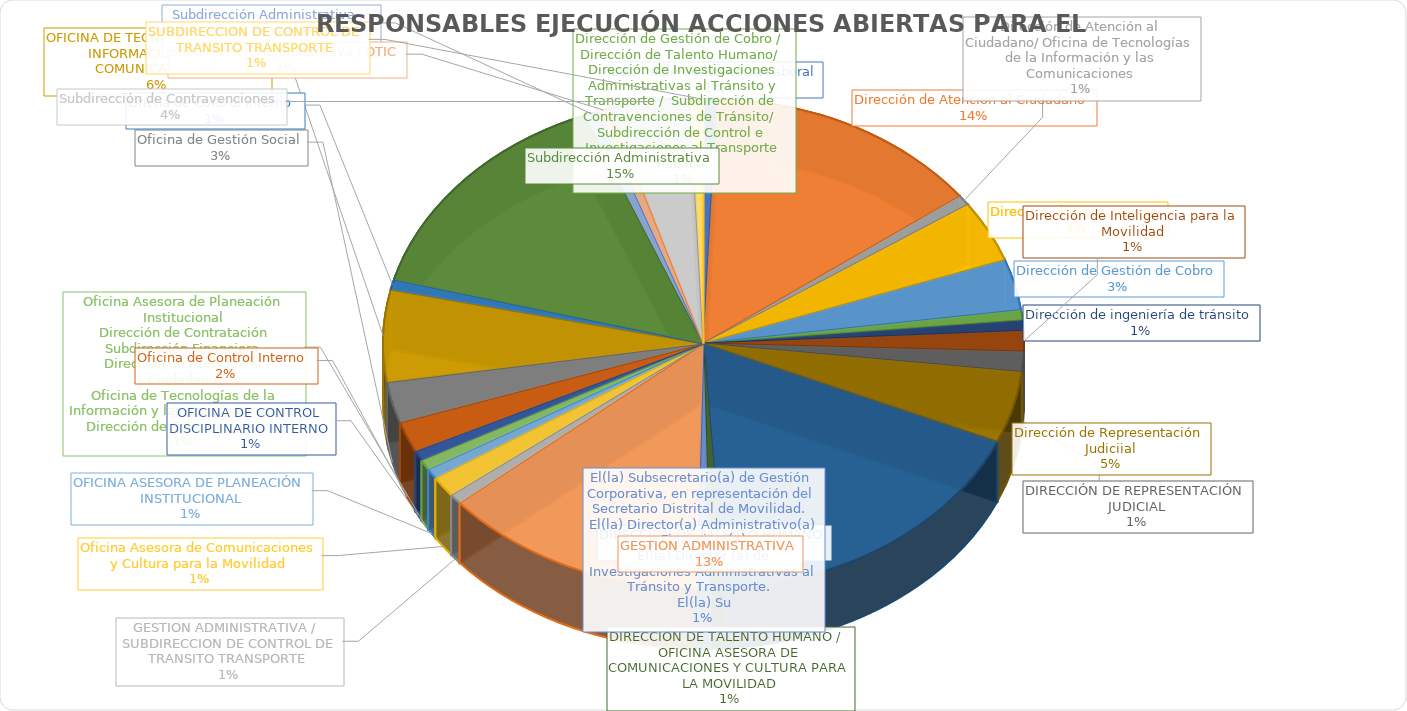
| Category | Cuenta de ESTADO DE LA ACCION |
|---|---|
| Comité de Convivencia Laboral | 1 |
| Dirección de Atención al Ciudadano | 21 |
| Dirección de Atención al Ciudadano/ Oficina de Tecnologías de la Información y las Comunicaciones | 1 |
| Dirección de Contratación | 6 |
| Dirección de Gestión de Cobro | 5 |
| Dirección de Gestión de Cobro /  Dirección de Talento Humano/  Dirección de Investigaciones Administrativas al Tránsito y Transporte /  Subdirección de Contravenciones de Tránsito/  Subdirección de Control e Investigaciones al Transporte Público. | 1 |
| Dirección de ingeniería de tránsito | 1 |
| Dirección de Inteligencia para la Movilidad | 2 |
| DIRECCIÓN DE REPRESENTACIÓN JUDICIAL | 2 |
| Dirección de Representación Judiciial | 7 |
| DIRECCIÓN DE TALENTO HUMANO | 26 |
| DIRECCIÓN DE TALENTO HUMANO /  OFICINA ASESORA DE COMUNICACIONES Y CULTURA PARA LA MOVILIDAD | 1 |
| El(la) Subsecretario(a) de Gestión Corporativa, en representación del Secretario Distrital de Movilidad. 
 El(la) Director(a) Administrativo(a) y Financiero(a). 
 El(la) Director (a) de Investigaciones Administrativas al Tránsito y Transporte. 
 El(la) Su | 1 |
| GESTION ADMINISTRATIVA | 20 |
| GESTION ADMINISTRATIVA / 
 SUBDIRECCION DE CONTROL DE TRANSITO TRANSPORTE | 1 |
| Oficina Asesora de Comunicaciones y Cultura para la Movilidad | 2 |
| OFICINA ASESORA DE PLANEACIÓN INSTITUCIONAL | 1 |
| Oficina Asesora de Planeación Institucional
 Dirección de Contratación
 Subdirección Financiera
 Dirección de Atención al Ciudadano
 Oficina de Tecnologías de la Información y las Comunicaciones
 Dirección de Talento Humano | 1 |
| OFICINA DE CONTROL DISCIPLINARIO INTERNO | 1 |
| Oficina de Control Interno  | 3 |
| Oficina de Gestión Social | 4 |
| OFICINA DE TECNOLOGÍAS DE LA INFORMACIÓN Y LAS COMUNICACIONES | 9 |
| Oficna de Control interno  | 1 |
| Subdirección Administrativa | 22 |
| Subdirección Administrativa - Subdirección de semaforización | 1 |
| Subdirección Administrativa / OTIC | 1 |
| Subdirección de Contravenciones | 6 |
| SUBDIRECCION DE CONTROL DE TRANSITO TRANSPORTE | 1 |